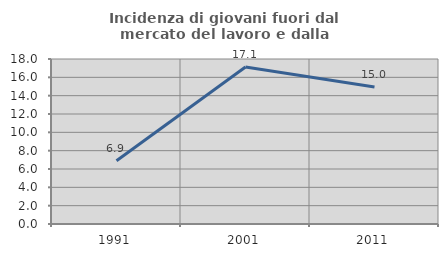
| Category | Incidenza di giovani fuori dal mercato del lavoro e dalla formazione  |
|---|---|
| 1991.0 | 6.893 |
| 2001.0 | 17.121 |
| 2011.0 | 14.956 |